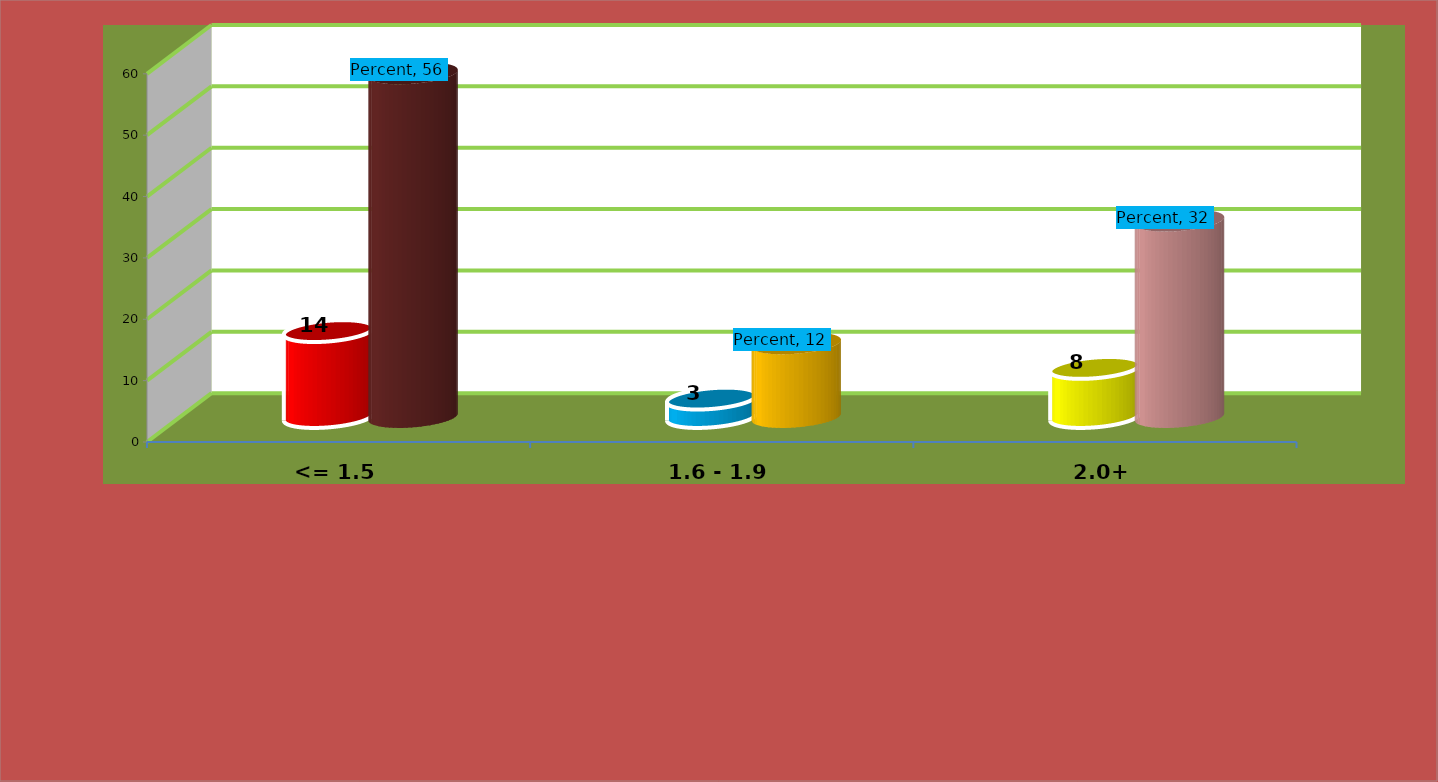
| Category | Frequency | Percent |
|---|---|---|
| <= 1.5 | 14 | 56 |
| 1.6 - 1.9 | 3 | 12 |
| 2.0+ | 8 | 32 |